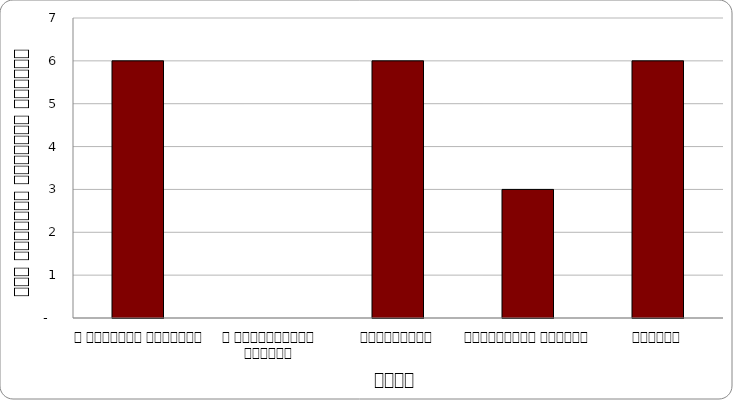
| Category | अन्य |
|---|---|
| द हिमालयन टाइम्स् | 6 |
| द काठमाण्डौं पोस्ट् | 0 |
| कान्तिपुर | 6 |
| अन्नपूर्ण पोस्ट् | 3 |
| नागरिक | 6 |